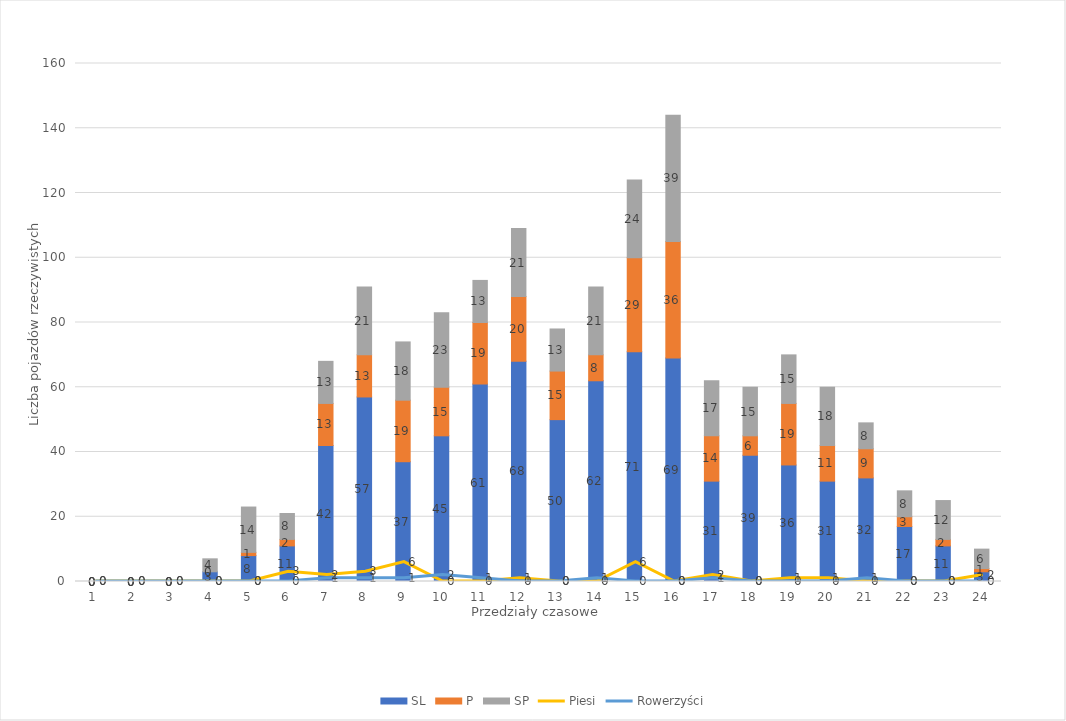
| Category | SL | P | SP |
|---|---|---|---|
| 0 | 0 | 0 | 0 |
| 1 | 0 | 0 | 0 |
| 2 | 0 | 0 | 0 |
| 3 | 3 | 0 | 4 |
| 4 | 8 | 1 | 14 |
| 5 | 11 | 2 | 8 |
| 6 | 42 | 13 | 13 |
| 7 | 57 | 13 | 21 |
| 8 | 37 | 19 | 18 |
| 9 | 45 | 15 | 23 |
| 10 | 61 | 19 | 13 |
| 11 | 68 | 20 | 21 |
| 12 | 50 | 15 | 13 |
| 13 | 62 | 8 | 21 |
| 14 | 71 | 29 | 24 |
| 15 | 69 | 36 | 39 |
| 16 | 31 | 14 | 17 |
| 17 | 39 | 6 | 15 |
| 18 | 36 | 19 | 15 |
| 19 | 31 | 11 | 18 |
| 20 | 32 | 9 | 8 |
| 21 | 17 | 3 | 8 |
| 22 | 11 | 2 | 12 |
| 23 | 3 | 1 | 6 |